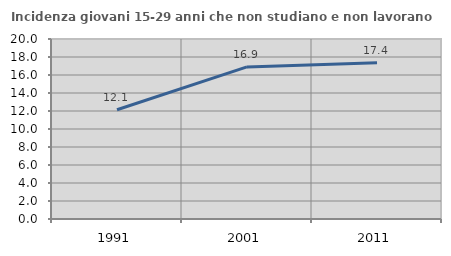
| Category | Incidenza giovani 15-29 anni che non studiano e non lavorano  |
|---|---|
| 1991.0 | 12.134 |
| 2001.0 | 16.901 |
| 2011.0 | 17.375 |